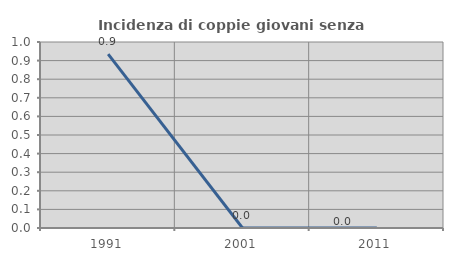
| Category | Incidenza di coppie giovani senza figli |
|---|---|
| 1991.0 | 0.935 |
| 2001.0 | 0 |
| 2011.0 | 0 |